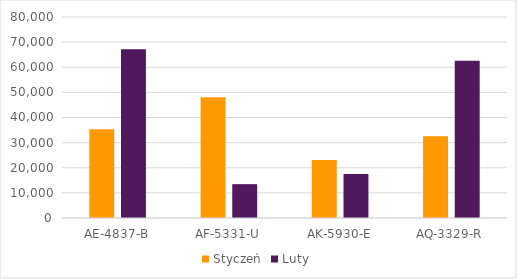
| Category | Styczeń | Luty |
|---|---|---|
| AE-4837-B | 35367 | 67137 |
| AF-5331-U | 48019 | 13470 |
| AK-5930-E | 23121 | 17471 |
| AQ-3329-R | 32568 | 62564 |